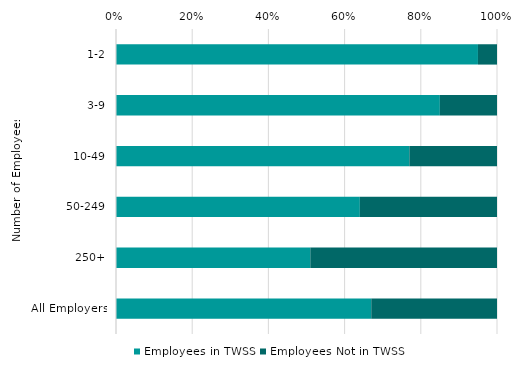
| Category | Employees in TWSS | Employees Not in TWSS |
|---|---|---|
| 1-2 | 0.95 | 0.05 |
| 3-9 | 0.85 | 0.15 |
| 10-49 | 0.77 | 0.23 |
| 50-249 | 0.64 | 0.36 |
| 250+ | 0.51 | 0.49 |
| All Employers | 0.67 | 0.33 |